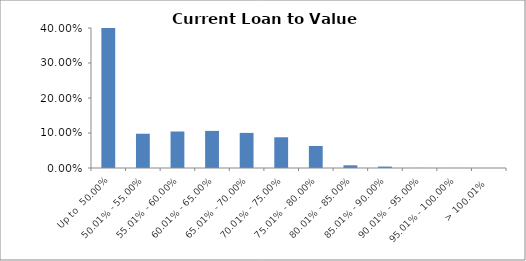
| Category | Series 0 |
|---|---|
| Up to  50.00% | 0.429 |
| 50.01% - 55.00% | 0.098 |
| 55.01% - 60.00% | 0.104 |
| 60.01% - 65.00% | 0.106 |
| 65.01% - 70.00% | 0.1 |
| 70.01% - 75.00% | 0.088 |
| 75.01% - 80.00% | 0.063 |
| 80.01% - 85.00% | 0.008 |
| 85.01% - 90.00% | 0.004 |
| 90.01% - 95.00% | 0 |
| 95.01% - 100.00% | 0 |
| > 100.01% | 0 |